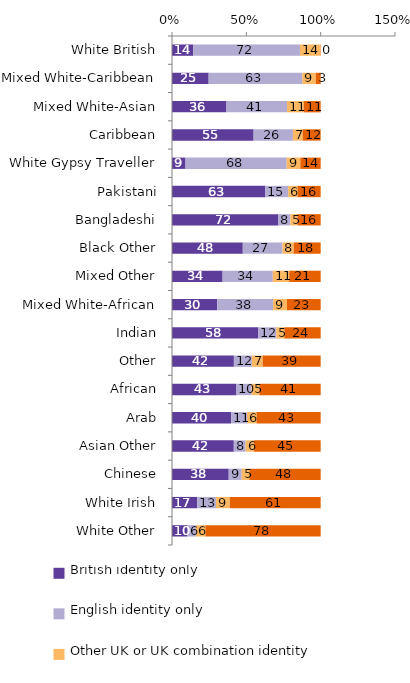
| Category | British identity only | English identity only | Other UK or UK combination identity | Foreign identity only |
|---|---|---|---|---|
| White British | 14.295 | 71.783 | 13.624 | 0.298 |
| Mixed White-Caribbean | 24.654 | 63 | 9.069 | 3.276 |
| Mixed White-Asian | 36.326 | 41.045 | 11.253 | 11.375 |
| Caribbean | 54.902 | 26.448 | 6.548 | 12.103 |
| White Gypsy Traveller | 9.096 | 68.03 | 9.192 | 13.682 |
| Pakistani | 62.806 | 15.32 | 6.31 | 15.564 |
| Bangladeshi | 71.579 | 8.013 | 4.831 | 15.576 |
| Black Other | 47.62 | 26.648 | 7.581 | 18.151 |
| Mixed Other | 34.029 | 33.784 | 11.054 | 21.133 |
| Mixed White-African | 30.378 | 37.609 | 9.365 | 22.649 |
| Indian | 58.09 | 12.055 | 5.419 | 24.437 |
| Other | 41.626 | 12.109 | 7.235 | 39.03 |
| African | 43.351 | 10.178 | 5.248 | 41.223 |
| Arab | 39.816 | 10.656 | 6.385 | 43.143 |
| Asian Other | 41.57 | 7.974 | 5.668 | 44.788 |
| Chinese | 38.166 | 8.742 | 5.148 | 47.943 |
| White Irish | 16.972 | 12.59 | 9.332 | 61.106 |
| White Other | 10.46 | 5.611 | 6.42 | 77.509 |